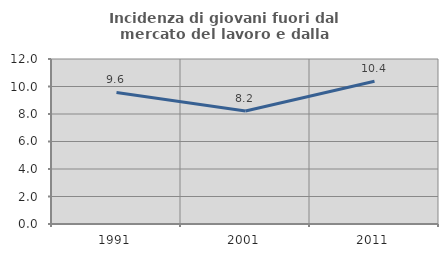
| Category | Incidenza di giovani fuori dal mercato del lavoro e dalla formazione  |
|---|---|
| 1991.0 | 9.569 |
| 2001.0 | 8.213 |
| 2011.0 | 10.383 |